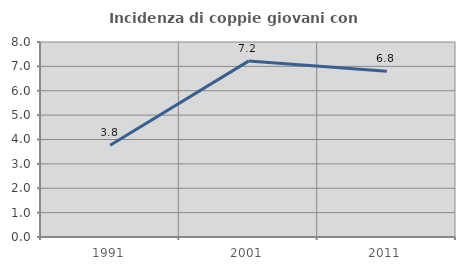
| Category | Incidenza di coppie giovani con figli |
|---|---|
| 1991.0 | 3.766 |
| 2001.0 | 7.216 |
| 2011.0 | 6.796 |